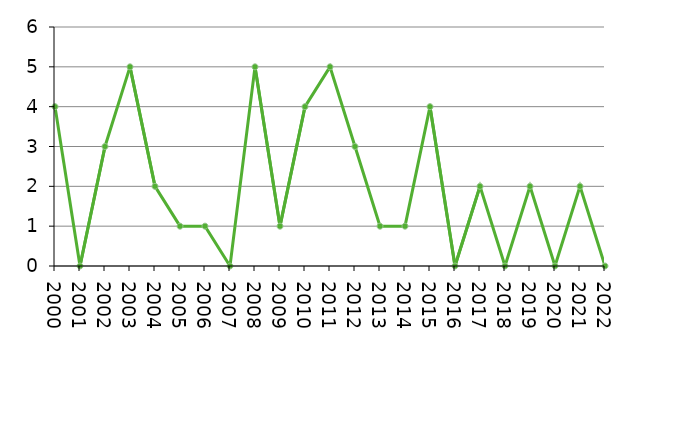
| Category | Avlidna |
|---|---|
| 2000 | 4 |
| 2001 | 0 |
| 2002 | 3 |
| 2003 | 5 |
| 2004 | 2 |
| 2005 | 1 |
| 2006 | 1 |
| 2007 | 0 |
| 2008 | 5 |
| 2009 | 1 |
| 2010 | 4 |
| 2011 | 5 |
| 2012 | 3 |
| 2013 | 1 |
| 2014 | 1 |
| 2015 | 4 |
| 2016 | 0 |
| 2017 | 2 |
| 2018 | 0 |
| 2019 | 2 |
| 2020 | 0 |
| 2021 | 2 |
| 2022 | 0 |